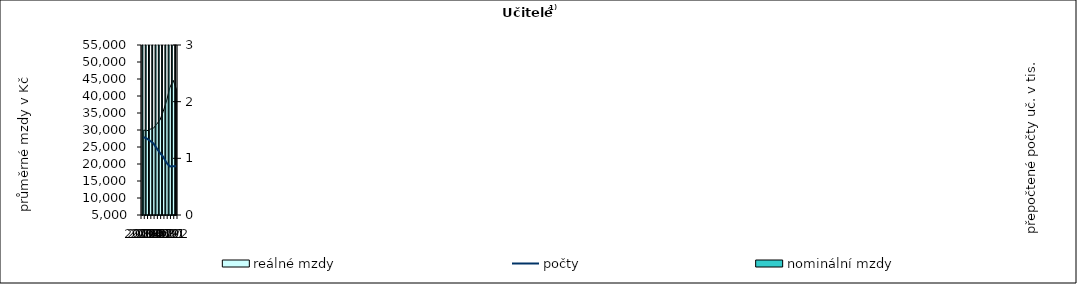
| Category | nominální mzdy |
|---|---|
| 2012.0 | 29364.853 |
| 2013.0 | 29568.413 |
| 2014.0 | 30151.818 |
| 2015.0 | 30524.818 |
| 2016.0 | 31966.908 |
| 2017.0 | 33959.633 |
| 2018.0 | 37401.5 |
| 2019.0 | 41734.304 |
| 2020.0 | 47430.685 |
| 2021.0 | 51398.297 |
| 2022.0 | 54768.828 |